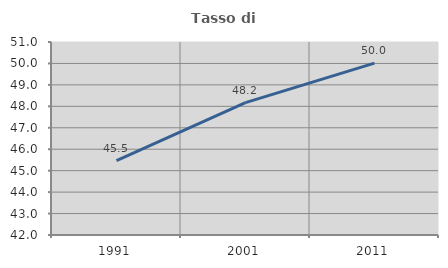
| Category | Tasso di occupazione   |
|---|---|
| 1991.0 | 45.468 |
| 2001.0 | 48.174 |
| 2011.0 | 50.018 |